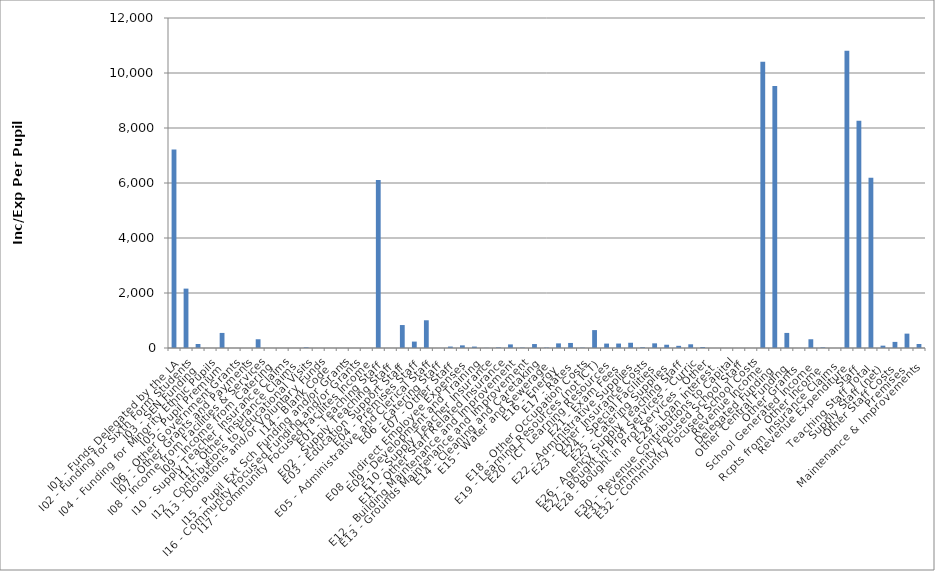
| Category | Series 0 |
|---|---|
| I01 - Funds Delegated by the LA | 7219.569 |
| I02 - Funding for Sixth Form Students | 2159.491 |
| I03 - SEN Funding | 145.481 |
| I04 - Funding for Minority Ethnic Pupils | 0 |
| I05 - Pupil Premium | 548.107 |
| I06 - Other Government Grants | 0 |
| I07 - Other Grants and Payments | 0 |
| I08 - Income from Facilities & Services | 318.018 |
| I09 - Income from Catering | 0 |
| I10 - Supply Teacher Insurance Claims | 0 |
| I11 - Other Insurance Claims | 0 |
| I12 - Contributions to Educational Visits | 22.624 |
| I13 - Donations and/or Voluntary Funds | 0 |
| I14 - Blank Code | 0 |
| I15 - Pupil Ext Sch Funding and/or Grants | 0 |
| I16 - Community Focused Funding and/or Grants | 0 |
| I17 - Community Focused Facilites Income | 0 |
| E01 - Teaching Staff | 6108.547 |
| E02 - Supply Teaching Staff | 0 |
| E03 - Education Support Staff | 834.873 |
| E04 - Premises Staff | 233.128 |
| E05 - Administrative and Clerical Staff | 1008.308 |
| E06 - Catering Staff | 0 |
| E07 - Other Staff | 52.518 |
| E08 - Indirect Employee Expenses | 96.009 |
| E09 - Development and Training | 52.036 |
| E10 - Supply Teacher Insurance | 6.001 |
| E11 - Other Staff Related Insurance | 21.458 |
| E12 - Building Maintenance and Improvement | 131.136 |
| E13 - Grounds Maintenance and Improvement | 14.401 |
| E14 - Cleaning and Caretaking | 144.008 |
| E15 - Water and Sewerage | 15.451 |
| E16 - Energy | 168.016 |
| E17 - Rates | 183.617 |
| E18 - Other Occupation Costs | 12.083 |
| E19 - Learning Resources (not ICT) | 650.775 |
| E20 - ICT Learning Resources | 160.623 |
| E21 - Exam Fees | 162.015 |
| E22 - Administrative Supplies | 190.385 |
| E23 - Other Insurance Costs | 28.583 |
| E24 - Special Facilities | 169.683 |
| E25 - Catering Supplies | 119.01 |
| E26 - Agency Supply Teaching Staff | 79.186 |
| E27 - Bought in Prof Services - Curric | 134.68 |
| E28 - Bought in Prof Services - Other | 35.799 |
| E29 - Loan Interest | 0 |
| E30 - Revenue Contributions to Capital | 0 |
| E31 - Community Focused School Staff | 0 |
| E32 - Community Focused School Costs | 0 |
| Revenue Income | 10413.291 |
| Delegated Funding | 9524.541 |
| Other Central Funding | 548.107 |
| Other Grants | 0 |
| School Generated Income | 318.018 |
| Other Income | 22.624 |
| Rcpts from Insurance Claims | 0 |
| Revenue Expenditure | 10812.33 |
| Staff | 8259.416 |
| Teaching Staff Total | 6193.733 |
| Supply Staff (net) | 85.186 |
| Other Staff Costs | 222.021 |
| Premises | 522.673 |
| Maintenance & Improvements | 145.538 |